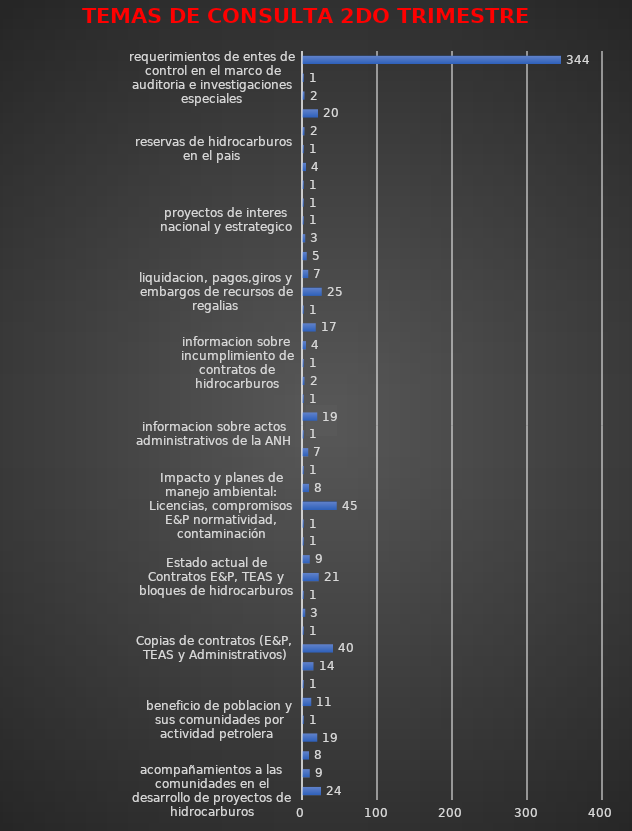
| Category | CANTIDAD |
|---|---|
| acompañamientos a las comunidades en el desarrollo de proyectos de hidrocarburos | 24 |
| asigancion de areas, areas libres, reglamentacion especial, requisitos y criterios para asignacion  | 9 |
| areas protegidas, reservas naturales,humedales y oarques nacionales naturales | 8 |
| asuntos de competencia de otra entidad  | 19 |
| beneficio de poblacion y sus comunidades por actividad petrolera  | 1 |
| cartografia de zonas petroleras | 11 |
| certificacion laboral  | 1 |
| cifras oficiales de produccion de hidrocarburos en el pais  | 14 |
| Copias de contratos (E&P, TEAS y Administrativos) | 40 |
| cuencas sedimentarias  | 1 |
| datos de sismica y pozos | 3 |
| Derechos de los particulares por el subsuelo  | 1 |
| Estado actual de Contratos E&P, TEAS y bloques de hidrocarburos | 21 |
| estado actual de los pozos  | 9 |
| estrategia teritorial de hidrocarburos | 1 |
| FAEP montos girados  | 1 |
| Impacto y planes de manejo ambiental: Licencias, compromisos E&P normatividad, contaminación | 45 |
| Inconformidad por desarrollo irregular de proyecto | 8 |
| Incumplimiento contratos E&P y TEAS | 1 |
| informacion de operadores en colombia  | 7 |
| informacion sobre actos administrativos de la ANH | 1 |
| informacion sobre proyectos de perforacion y profundidad  | 19 |
| informacion sobre concursos y listas de elegibles  | 1 |
| informacion presupuestal y plan anual de adquisiciones de la entidad  | 2 |
| informacion sobre incumplimiento de contratos de hidrocarburos | 1 |
| informacion y aclaracion de procesos contractuales, terminos de referencia, plazo y polizas  | 4 |
| Intervención por no pago a subcontratistas por parte de Operadoras  | 17 |
| inversion social | 1 |
| liquidacion, pagos,giros y embargos de recursos de regalias | 25 |
| normatividad sobre exploracion, regulacion y produccion de hidrocarburos | 7 |
| procesos de consultas previas con las comunidades en desarrollo de proyectos de hidrocarburos | 5 |
| procesos de servidumbres petroleras | 3 |
| proyectos de interes nacional y estrategico | 1 |
| proyectos y contratos de hidrocarburos en yacimientos no convencionales  | 1 |
| vinculacion de personal por contratistas en el desarrollo de proyectos de hidrocarburos  | 1 |
| Solicitud de información geológica y geofísica (sísmica y estatigrafía). | 4 |
| reservas de hidrocarburos en el pais  | 1 |
| quemas de gas en el sector de hidrocarburos | 2 |
| restitucion de tierras  | 20 |
| Temas tributarios en materia de hidrocarburos  | 2 |
| requerimientos de entes de control en el marco de auditoria e investigaciones especiales | 1 |
| TOTAL GENERAL | 344 |